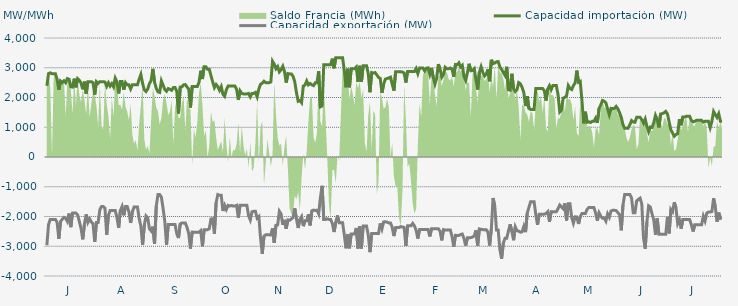
| Category | Capacidad importación (MW) | Capacidad exportación (MW) |
|---|---|---|
| 0 | 2393.75 | -2964.583 |
| 1900-01-01 | 2804.167 | -2270.833 |
| 1900-01-02 | 2829.167 | -2097.917 |
| 1900-01-03 | 2800 | -2097.917 |
| 1900-01-04 | 2800 | -2097.917 |
| 1900-01-05 | 2800 | -2097.917 |
| 1900-01-06 | 2610.417 | -2200 |
| 1900-01-07 | 2264.583 | -2750 |
| 1900-01-08 | 2556.25 | -2166.667 |
| 1900-01-09 | 2506.25 | -2095.833 |
| 1900-01-10 | 2564.583 | -2029.167 |
| 1900-01-11 | 2497.917 | -2058.333 |
| 1900-01-12 | 2635.417 | -2166.667 |
| 1900-01-13 | 2612.5 | -1900 |
| 1900-01-14 | 2362.5 | -2358.333 |
| 1900-01-15 | 2350 | -1885.417 |
| 1900-01-16 | 2633.333 | -1885.417 |
| 1900-01-17 | 2341.667 | -1885.417 |
| 1900-01-18 | 2633.333 | -1943.75 |
| 1900-01-19 | 2579.167 | -2168.75 |
| 1900-01-20 | 2485.417 | -2400 |
| 1900-01-21 | 2275 | -2766.667 |
| 1900-01-22 | 2533.333 | -2252.083 |
| 1900-01-23 | 2125 | -1929.167 |
| 1900-01-24 | 2533.333 | -2195.833 |
| 1900-01-25 | 2533.333 | -2072.917 |
| 1900-01-26 | 2533.333 | -2187.5 |
| 1900-01-27 | 2500 | -2237.5 |
| 1900-01-28 | 2100 | -2856.25 |
| 1900-01-29 | 2533.333 | -2202.083 |
| 1900-01-30 | 2475 | -2202.083 |
| 1900-01-31 | 2533.333 | -1768.75 |
| 1900-02-01 | 2533.333 | -1662.5 |
| 1900-02-02 | 2533.333 | -1662.5 |
| 1900-02-03 | 2518.75 | -1725 |
| 1900-02-04 | 2375 | -2614.583 |
| 1900-02-05 | 2495.833 | -1964.583 |
| 1900-02-06 | 2383.333 | -1800 |
| 1900-02-07 | 2466.667 | -1800 |
| 1900-02-08 | 2358.333 | -1800 |
| 1900-02-09 | 2650 | -1800 |
| 1900-02-10 | 2525 | -2037.5 |
| 1900-02-11 | 2135.417 | -2381.25 |
| 1900-02-12 | 2537.5 | -1800 |
| 1900-02-13 | 2537.5 | -1662.5 |
| 1900-02-14 | 2260.417 | -1960.417 |
| 1900-02-15 | 2500 | -1662.5 |
| 1900-02-16 | 2425 | -1662.5 |
| 1900-02-17 | 2425 | -1843.75 |
| 1900-02-18 | 2287.5 | -2216.667 |
| 1900-02-19 | 2425 | -1843.75 |
| 1900-02-20 | 2425 | -1681.25 |
| 1900-02-21 | 2425 | -1681.25 |
| 1900-02-22 | 2425 | -1681.25 |
| 1900-02-23 | 2616.667 | -2062.5 |
| 1900-02-24 | 2775 | -2329.167 |
| 1900-02-25 | 2475 | -2956.25 |
| 1900-02-26 | 2258.333 | -2293.75 |
| 1900-02-27 | 2200 | -1981.25 |
| 1900-02-28 | 2283.333 | -2043.75 |
| 1900-02-28 | 2466.667 | -2410.417 |
| 1900-03-01 | 2570.833 | -2485.417 |
| 1900-03-02 | 2962.5 | -2341.667 |
| 1900-03-03 | 2512.5 | -2920.833 |
| 1900-03-04 | 2308.333 | -1650 |
| 1900-03-05 | 2187.5 | -1262.5 |
| 1900-03-06 | 2170.833 | -1262.5 |
| 1900-03-07 | 2558.333 | -1352.083 |
| 1900-03-08 | 2416.667 | -1731.25 |
| 1900-03-09 | 2266.667 | -2175 |
| 1900-03-10 | 2208.333 | -2956.25 |
| 1900-03-11 | 2300 | -2268.75 |
| 1900-03-12 | 2275 | -2266.667 |
| 1900-03-13 | 2241.667 | -2266.667 |
| 1900-03-14 | 2333.333 | -2266.667 |
| 1900-03-15 | 2333.333 | -2270.833 |
| 1900-03-16 | 2212.5 | -2581.25 |
| 1900-03-17 | 1464.583 | -2725 |
| 1900-03-18 | 2350 | -2250 |
| 1900-03-19 | 2358.333 | -2218.75 |
| 1900-03-20 | 2425 | -2218.75 |
| 1900-03-21 | 2433.333 | -2218.75 |
| 1900-03-22 | 2354.167 | -2368.75 |
| 1900-03-23 | 2279.167 | -2575 |
| 1900-03-24 | 1662.5 | -3079.167 |
| 1900-03-25 | 2366.667 | -2522.917 |
| 1900-03-26 | 2366.667 | -2527.083 |
| 1900-03-27 | 2366.667 | -2527.083 |
| 1900-03-28 | 2366.667 | -2527.083 |
| 1900-03-29 | 2508.333 | -2527.083 |
| 1900-03-30 | 2900 | -2477.083 |
| 1900-03-31 | 2620.833 | -3004.167 |
| 1900-04-01 | 3033.333 | -2443.75 |
| 1900-04-02 | 3033.333 | -2443.75 |
| 1900-04-03 | 2950 | -2443.75 |
| 1900-04-04 | 2950 | -2410.417 |
| 1900-04-05 | 2735.417 | -2081.25 |
| 1900-04-06 | 2525 | -2075 |
| 1900-04-07 | 2332.667 | -2579.167 |
| 1900-04-08 | 2437.5 | -1537.5 |
| 1900-04-09 | 2366.667 | -1262.5 |
| 1900-04-10 | 2241.667 | -1287.5 |
| 1900-04-11 | 2366.667 | -1287.5 |
| 1900-04-12 | 2108.333 | -1814.583 |
| 1900-04-13 | 2039.583 | -1625 |
| 1900-04-14 | 2264.583 | -1762.5 |
| 1900-04-15 | 2383.333 | -1625 |
| 1900-04-16 | 2383.333 | -1650 |
| 1900-04-17 | 2383.333 | -1629.167 |
| 1900-04-18 | 2383.333 | -1650 |
| 1900-04-19 | 2383.333 | -1650 |
| 1900-04-20 | 2275 | -1625 |
| 1900-04-21 | 1918.75 | -2037.5 |
| 1900-04-22 | 2225 | -1625 |
| 1900-04-23 | 2138.417 | -1625 |
| 1900-04-24 | 2120.833 | -1625 |
| 1900-04-25 | 2120.833 | -1625 |
| 1900-04-26 | 2120.833 | -1625 |
| 1900-04-27 | 2137.5 | -1975 |
| 1900-04-28 | 2020 | -2116 |
| 1900-04-29 | 2137.5 | -1841.667 |
| 1900-04-30 | 2137.5 | -1825 |
| 1900-05-01 | 2170.833 | -1825 |
| 1900-05-02 | 2022.917 | -2054.167 |
| 1900-05-03 | 2287.5 | -2000 |
| 1900-05-04 | 2445.833 | -2731.25 |
| 1900-05-05 | 2481.25 | -3254.167 |
| 1900-05-06 | 2547.917 | -2662.5 |
| 1900-05-07 | 2500 | -2616.667 |
| 1900-05-08 | 2500 | -2616.667 |
| 1900-05-09 | 2500 | -2616.667 |
| 1900-05-10 | 2520.833 | -2620.833 |
| 1900-05-11 | 3218.75 | -2393.75 |
| 1900-05-12 | 3120.833 | -2885.417 |
| 1900-05-13 | 2966.667 | -2295.833 |
| 1900-05-14 | 3041.667 | -2281.25 |
| 1900-05-15 | 2862.5 | -1822.917 |
| 1900-05-16 | 2933.333 | -1914.583 |
| 1900-05-17 | 3050 | -2281.25 |
| 1900-05-18 | 2875 | -2112.5 |
| 1900-05-19 | 2500 | -2410.417 |
| 1900-05-20 | 2804.167 | -2112.5 |
| 1900-05-21 | 2791.667 | -2125 |
| 1900-05-22 | 2791.667 | -2083.333 |
| 1900-05-23 | 2716.667 | -2031.25 |
| 1900-05-24 | 2529.167 | -1727.083 |
| 1900-05-25 | 2162.5 | -2085.417 |
| 1900-05-26 | 1872.917 | -2385.417 |
| 1900-05-27 | 1897.917 | -2095.833 |
| 1900-05-28 | 1825 | -2002.083 |
| 1900-05-29 | 2383.333 | -2325 |
| 1900-05-30 | 2418.75 | -2145.833 |
| 1900-05-31 | 2558.333 | -2145.833 |
| 1900-06-01 | 2425 | -1925 |
| 1900-06-02 | 2470.833 | -2300 |
| 1900-06-03 | 2425 | -1808.333 |
| 1900-06-04 | 2400 | -1785.417 |
| 1900-06-05 | 2495.833 | -1795.833 |
| 1900-06-06 | 2497.917 | -1789.583 |
| 1900-06-07 | 2882.917 | -1912.5 |
| 1900-06-08 | 1685.417 | -1368.75 |
| 1900-06-09 | 1712.5 | -968.75 |
| 1900-06-10 | 3104.167 | -2100 |
| 1900-06-11 | 3104.167 | -2100 |
| 1900-06-12 | 3104.167 | -2075 |
| 1900-06-13 | 3104.167 | -2100 |
| 1900-06-14 | 3104.167 | -2100 |
| 1900-06-15 | 3306.25 | -2237.5 |
| 1900-06-16 | 2981.25 | -2520.833 |
| 1900-06-17 | 3333.333 | -2189.583 |
| 1900-06-18 | 3333.333 | -1964.583 |
| 1900-06-19 | 3333.333 | -2212.5 |
| 1900-06-20 | 3333.333 | -2212.5 |
| 1900-06-21 | 3333.333 | -2212.5 |
| 1900-06-22 | 2904.167 | -2625 |
| 1900-06-23 | 2343.75 | -3068.75 |
| 1900-06-24 | 2966.667 | -2589.583 |
| 1900-06-25 | 2343.75 | -3068.75 |
| 1900-06-26 | 2966.667 | -2589.583 |
| 1900-06-27 | 2966.667 | -2589.583 |
| 1900-06-28 | 2966.667 | -2589.583 |
| 1900-06-29 | 3025 | -2385.417 |
| 1900-06-30 | 2525 | -3075 |
| 1900-07-01 | 3066.667 | -2320.833 |
| 1900-07-02 | 2525 | -3075 |
| 1900-07-03 | 3066.667 | -2320.833 |
| 1900-07-04 | 3066.667 | -2320.833 |
| 1900-07-05 | 3066.667 | -2320.833 |
| 1900-07-06 | 2800 | -2622.917 |
| 1900-07-07 | 2177.083 | -3197.917 |
| 1900-07-08 | 2837.5 | -2568.75 |
| 1900-07-09 | 2820.833 | -2568.75 |
| 1900-07-10 | 2837.5 | -2568.75 |
| 1900-07-11 | 2758.333 | -2568.75 |
| 1900-07-12 | 2675 | -2568.75 |
| 1900-07-13 | 2641.667 | -2233.333 |
| 1900-07-14 | 2156.25 | -2418.75 |
| 1900-07-15 | 2450 | -2181.25 |
| 1900-07-16 | 2616.667 | -2179.167 |
| 1900-07-17 | 2637.5 | -2187.5 |
| 1900-07-18 | 2658.333 | -2216.667 |
| 1900-07-19 | 2683.333 | -2216.667 |
| 1900-07-20 | 2450 | -2362.5 |
| 1900-07-21 | 2231.25 | -2658.333 |
| 1900-07-22 | 2866.667 | -2372.917 |
| 1900-07-23 | 2866.667 | -2372.917 |
| 1900-07-24 | 2866.667 | -2372.917 |
| 1900-07-25 | 2866.667 | -2339.583 |
| 1900-07-26 | 2854.167 | -2352.083 |
| 1900-07-27 | 2825 | -2368.75 |
| 1900-07-28 | 2504.167 | -2991.667 |
| 1900-07-29 | 2875 | -2314.583 |
| 1900-07-30 | 2875 | -2314.583 |
| 1900-07-31 | 2875 | -2314.583 |
| 1900-08-01 | 2875 | -2231.25 |
| 1900-08-02 | 2875 | -2314.583 |
| 1900-08-03 | 2975 | -2462.5 |
| 1900-08-04 | 2802.083 | -2741.667 |
| 1900-08-05 | 2987.5 | -2433.333 |
| 1900-08-06 | 2987.5 | -2433.333 |
| 1900-08-07 | 2987.5 | -2433.333 |
| 1900-08-08 | 2893.75 | -2433.333 |
| 1900-08-09 | 2987.5 | -2433.333 |
| 1900-08-10 | 2995.833 | -2437.5 |
| 1900-08-11 | 2781.25 | -2670.833 |
| 1900-08-12 | 2993.75 | -2412.5 |
| 1900-08-13 | 2679.167 | -2412.5 |
| 1900-08-14 | 2450 | -2412.5 |
| 1900-08-15 | 2645.833 | -2412.5 |
| 1900-08-16 | 3120.833 | -2412.5 |
| 1900-08-17 | 2958.333 | -2495.833 |
| 1900-08-18 | 2681.25 | -2802.083 |
| 1900-08-19 | 2768.75 | -2439.583 |
| 1900-08-20 | 3016.667 | -2456.25 |
| 1900-08-21 | 2966.667 | -2454.167 |
| 1900-08-22 | 2966.667 | -2452.083 |
| 1900-08-23 | 2991.667 | -2454.167 |
| 1900-08-24 | 2952.083 | -2670.833 |
| 1900-08-25 | 2697.917 | -3016.667 |
| 1900-08-26 | 3108.333 | -2631.25 |
| 1900-08-27 | 3100 | -2637.5 |
| 1900-08-28 | 3166.667 | -2637.5 |
| 1900-08-29 | 3025 | -2604.167 |
| 1900-08-30 | 3083.333 | -2589.583 |
| 1900-08-31 | 2708.333 | -2743.75 |
| 1900-09-01 | 2570.833 | -2979.167 |
| 1900-09-02 | 2833.333 | -2716.667 |
| 1900-09-03 | 3133.333 | -2716.667 |
| 1900-09-04 | 2900 | -2710.417 |
| 1900-09-05 | 2904.167 | -2689.583 |
| 1900-09-06 | 2966.667 | -2654.167 |
| 1900-09-07 | 2587.5 | -2462.5 |
| 1900-09-08 | 2266.667 | -2977.083 |
| 1900-09-09 | 2845.833 | -2416.667 |
| 1900-09-10 | 3033.333 | -2429.167 |
| 1900-09-11 | 2845.833 | -2441.667 |
| 1900-09-12 | 2725 | -2441.667 |
| 1900-09-13 | 2783.333 | -2441.667 |
| 1900-09-14 | 2943.75 | -2529.167 |
| 1900-09-15 | 2545.833 | -2975 |
| 1900-09-16 | 3266.667 | -2410.417 |
| 1900-09-17 | 3137.5 | -1379.167 |
| 1900-09-18 | 3158.333 | -1654.167 |
| 1900-09-19 | 3200 | -2454.167 |
| 1900-09-20 | 3208.333 | -2456.25 |
| 1900-09-21 | 3025 | -3112.5 |
| 1900-09-22 | 2943.75 | -3418.75 |
| 1900-09-23 | 2835.417 | -2900 |
| 1900-09-24 | 2741.667 | -2729.167 |
| 1900-09-25 | 3033.333 | -2729.167 |
| 1900-09-26 | 2262.5 | -2487.5 |
| 1900-09-27 | 2245.833 | -2262.5 |
| 1900-09-28 | 2797.917 | -2500 |
| 1900-09-29 | 2295.652 | -2797.826 |
| 1900-09-30 | 2200 | -2350 |
| 1900-10-01 | 2262.5 | -2481.25 |
| 1900-10-02 | 2500 | -2491.667 |
| 1900-10-03 | 2458.333 | -2529.167 |
| 1900-10-04 | 2341.667 | -2512.5 |
| 1900-10-05 | 2162.5 | -2331.25 |
| 1900-10-06 | 1712.5 | -2525 |
| 1900-10-07 | 2043.75 | -1885.417 |
| 1900-10-08 | 1629.167 | -1687.5 |
| 1900-10-09 | 1600 | -1500 |
| 1900-10-10 | 1600 | -1500 |
| 1900-10-11 | 1600 | -1500 |
| 1900-10-12 | 2300 | -1937.5 |
| 1900-10-13 | 2300 | -2281.25 |
| 1900-10-14 | 2300 | -1920.833 |
| 1900-10-15 | 2300 | -1920.833 |
| 1900-10-16 | 2300 | -1920.833 |
| 1900-10-17 | 2225 | -1920.833 |
| 1900-10-18 | 1896.083 | -1898.167 |
| 1900-10-19 | 2287.5 | -1837.5 |
| 1900-10-20 | 2400 | -2181.25 |
| 1900-10-21 | 2266.667 | -1837.5 |
| 1900-10-22 | 2400 | -1841.667 |
| 1900-10-23 | 2400 | -1841.667 |
| 1900-10-24 | 2400 | -1841.667 |
| 1900-10-25 | 2100 | -1737.5 |
| 1900-10-26 | 1512.5 | -1612.5 |
| 1900-10-27 | 1575 | -1675 |
| 1900-10-28 | 1975 | -1737.5 |
| 1900-10-29 | 2008.333 | -1560.417 |
| 1900-10-30 | 2056.25 | -2133.333 |
| 1900-10-31 | 2400 | -1570.833 |
| 1900-11-01 | 2300 | -1570.833 |
| 1900-11-02 | 2266.667 | -2031.25 |
| 1900-11-03 | 2400 | -2225 |
| 1900-11-04 | 2487.5 | -2010.417 |
| 1900-11-05 | 2904.167 | -2016.667 |
| 1900-11-06 | 2512.5 | -2250 |
| 1900-11-07 | 2541.667 | -2000 |
| 1900-11-08 | 1884.392 | -1900 |
| 1900-11-09 | 1133.333 | -1900 |
| 1900-11-10 | 1520.875 | -1900 |
| 1900-11-11 | 1166.667 | -1758.333 |
| 1900-11-12 | 1183.333 | -1700 |
| 1900-11-13 | 1158.333 | -1700 |
| 1900-11-14 | 1200 | -1700 |
| 1900-11-15 | 1200 | -1700 |
| 1900-11-16 | 1304.583 | -1887.5 |
| 1900-11-17 | 1145.417 | -2139.583 |
| 1900-11-18 | 1629.167 | -1875 |
| 1900-11-19 | 1750 | -1987.5 |
| 1900-11-20 | 1900 | -2058.333 |
| 1900-11-21 | 1879.167 | -2050 |
| 1900-11-22 | 1820.833 | -2156.25 |
| 1900-11-23 | 1616.667 | -1912.5 |
| 1900-11-24 | 1420.833 | -2027.083 |
| 1900-11-25 | 1633.333 | -1812.5 |
| 1900-11-26 | 1625 | -1791.667 |
| 1900-11-27 | 1637.5 | -1791.667 |
| 1900-11-28 | 1700 | -1800 |
| 1900-11-29 | 1620.833 | -1868.75 |
| 1900-11-30 | 1487.5 | -1937.5 |
| 1900-12-01 | 1337.5 | -2464.583 |
| 1900-12-02 | 1083.333 | -1610.417 |
| 1900-12-03 | 966.667 | -1258.333 |
| 1900-12-04 | 966.667 | -1258.333 |
| 1900-12-05 | 966.667 | -1258.333 |
| 1900-12-06 | 1083.333 | -1258.333 |
| 1900-12-07 | 1225 | -1375 |
| 1900-12-08 | 1175 | -1875 |
| 1900-12-09 | 1166.667 | -1875 |
| 1900-12-10 | 1333.333 | -1475 |
| 1900-12-11 | 1333.333 | -1425 |
| 1900-12-12 | 1333.333 | -1383.333 |
| 1900-12-13 | 1254.167 | -1577.083 |
| 1900-12-14 | 1133.333 | -2725 |
| 1900-12-15 | 1275 | -3081.25 |
| 1900-12-16 | 1029.167 | -2189.583 |
| 1900-12-17 | 850 | -1641.667 |
| 1900-12-18 | 1008.333 | -1683.333 |
| 1900-12-19 | 991.667 | -1916.667 |
| 1900-12-20 | 1150 | -2114.583 |
| 1900-12-21 | 1400 | -2612.5 |
| 1900-12-22 | 1262.5 | -2058.333 |
| 1900-12-23 | 995.833 | -2600 |
| 1900-12-24 | 1445.833 | -2600 |
| 1900-12-25 | 1458.333 | -2600 |
| 1900-12-26 | 1483.333 | -2600 |
| 1900-12-27 | 1533.333 | -2600 |
| 1900-12-28 | 1450 | -2012.5 |
| 1900-12-29 | 1175 | -2566.667 |
| 1900-12-30 | 912.5 | -1762.5 |
| 1900-12-31 | 806.25 | -1841.667 |
| 1901-01-01 | 700 | -1520.833 |
| 1901-01-02 | 756.25 | -1710.417 |
| 1901-01-03 | 783.333 | -2239.583 |
| 1901-01-04 | 1270.833 | -2112.5 |
| 1901-01-05 | 1066.667 | -2410.417 |
| 1901-01-06 | 1345.833 | -2104.167 |
| 1901-01-07 | 1341.667 | -2104.167 |
| 1901-01-08 | 1366.667 | -2104.167 |
| 1901-01-09 | 1366.667 | -2104.167 |
| 1901-01-10 | 1366.667 | -2104.167 |
| 1901-01-11 | 1231.25 | -2275 |
| 1901-01-12 | 1181.25 | -2504.167 |
| 1901-01-13 | 1200 | -2275 |
| 1901-01-14 | 1233.333 | -2275 |
| 1901-01-15 | 1233.333 | -2275 |
| 1901-01-16 | 1233.333 | -2275 |
| 1901-01-17 | 1233.333 | -2275 |
| 1901-01-18 | 1175 | -1987.5 |
| 1901-01-19 | 1200 | -2147.917 |
| 1901-01-20 | 1200 | -1887.5 |
| 1901-01-21 | 1200 | -1850 |
| 1901-01-22 | 987.5 | -1850 |
| 1901-01-23 | 1200 | -1831.25 |
| 1901-01-24 | 1529.167 | -1387.5 |
| 1901-01-25 | 1427.083 | -1679.167 |
| 1901-01-26 | 1331.25 | -2172.917 |
| 1901-01-27 | 1456.25 | -1868.75 |
| 1901-01-28 | 1200 | -2060.417 |
| 1901-01-29 | 1200 | -2029.167 |